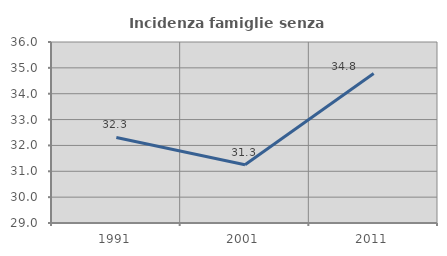
| Category | Incidenza famiglie senza nuclei |
|---|---|
| 1991.0 | 32.308 |
| 2001.0 | 31.25 |
| 2011.0 | 34.783 |